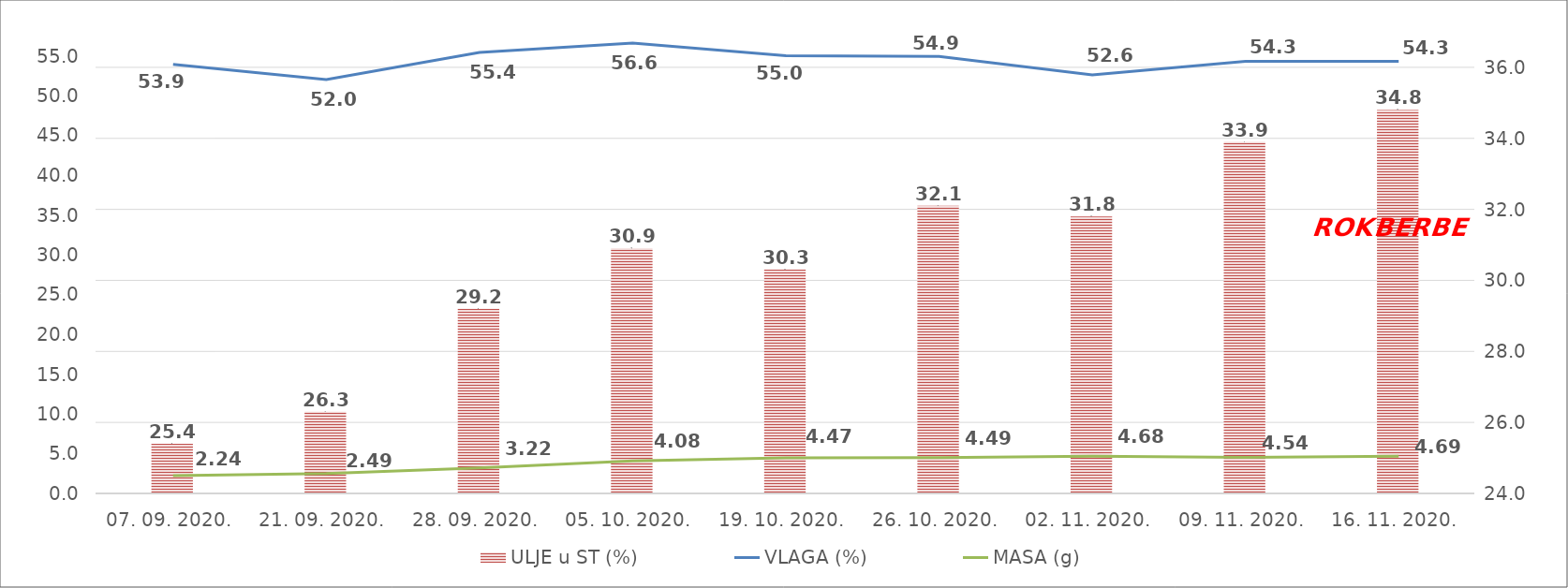
| Category | ULJE u ST (%) |
|---|---|
| 07. 09. 2020. | 25.4 |
| 21. 09. 2020. | 26.3 |
| 28. 09. 2020. | 29.2 |
| 05. 10. 2020. | 30.9 |
| 19. 10. 2020. | 30.3 |
| 26. 10. 2020. | 32.1 |
| 02. 11. 2020. | 31.8 |
| 09. 11. 2020. | 33.9 |
| 16. 11. 2020. | 34.8 |